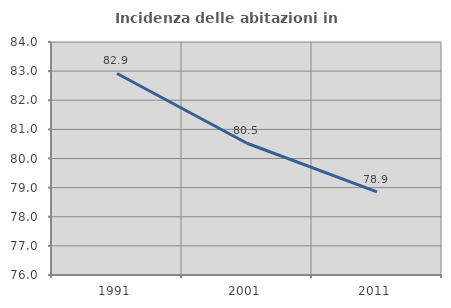
| Category | Incidenza delle abitazioni in proprietà  |
|---|---|
| 1991.0 | 82.919 |
| 2001.0 | 80.523 |
| 2011.0 | 78.857 |